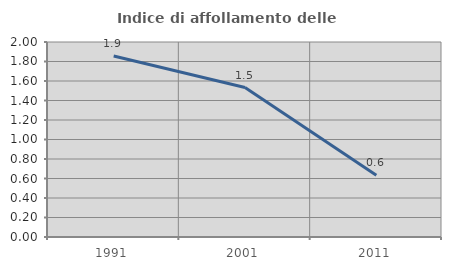
| Category | Indice di affollamento delle abitazioni  |
|---|---|
| 1991.0 | 1.857 |
| 2001.0 | 1.533 |
| 2011.0 | 0.635 |